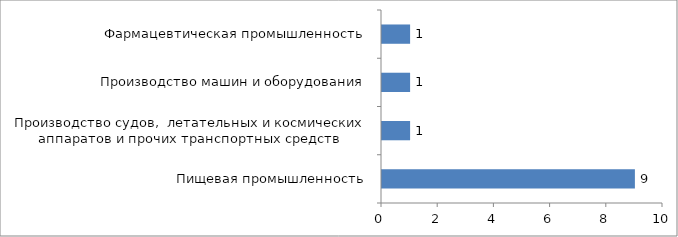
| Category | Series 0 |
|---|---|
| Пищевая промышленность | 9 |
| Производство судов,  летательных и космических аппаратов и прочих транспортных средств
 | 1 |
| Производство машин и оборудования | 1 |
| Фармацевтическая промышленность | 1 |